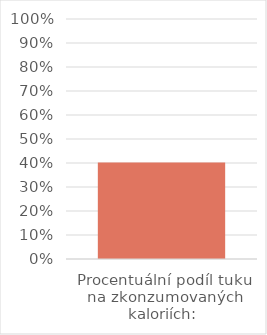
| Category | Series 0 |
|---|---|
| Procentuální podíl tuku na zkonzumovaných kaloriích: | 0.402 |